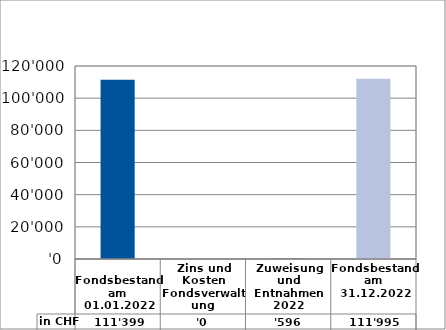
| Category | in CHF |
|---|---|
| 
Fondsbestand am 01.01.2022

 | 111399 |
| Zins und Kosten Fondsverwaltung | 0 |
| Zuweisung und Entnahmen 2022 | 596.45 |
| Fondsbestand am 31.12.2022 | 111995.45 |